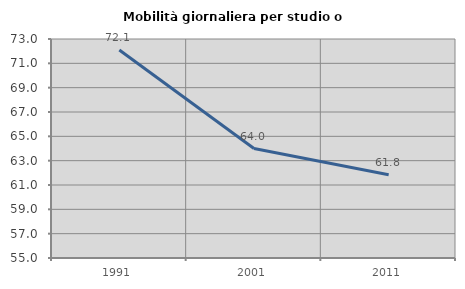
| Category | Mobilità giornaliera per studio o lavoro |
|---|---|
| 1991.0 | 72.093 |
| 2001.0 | 64 |
| 2011.0 | 61.842 |